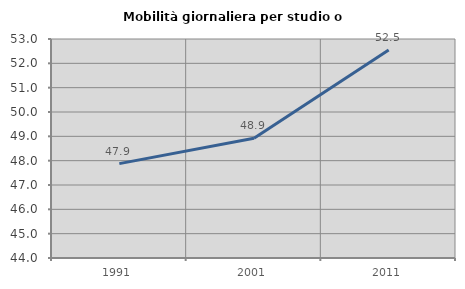
| Category | Mobilità giornaliera per studio o lavoro |
|---|---|
| 1991.0 | 47.879 |
| 2001.0 | 48.923 |
| 2011.0 | 52.548 |